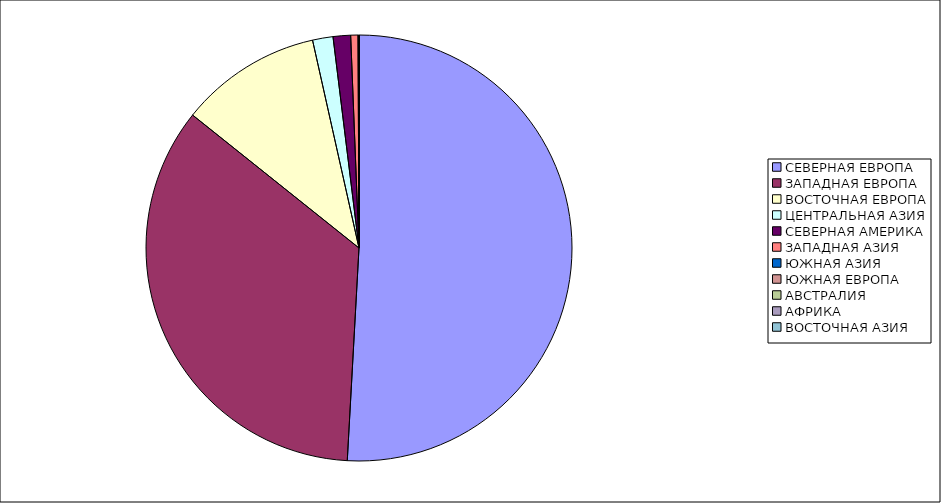
| Category | Оборот |
|---|---|
| СЕВЕРНАЯ ЕВРОПА | 50.876 |
| ЗАПАДНАЯ ЕВРОПА | 34.852 |
| ВОСТОЧНАЯ ЕВРОПА | 10.771 |
| ЦЕНТРАЛЬНАЯ АЗИЯ | 1.551 |
| СЕВЕРНАЯ АМЕРИКА | 1.325 |
| ЗАПАДНАЯ АЗИЯ | 0.551 |
| ЮЖНАЯ АЗИЯ | 0.041 |
| ЮЖНАЯ ЕВРОПА | 0.026 |
| АВСТРАЛИЯ | 0.002 |
| АФРИКА | 0.002 |
| ВОСТОЧНАЯ АЗИЯ | 0.002 |